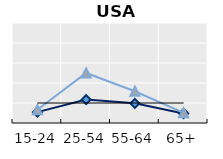
| Category | Public goods | Individual items only | Series 1 |
|---|---|---|---|
| 15-24 | 0.544 | 0.665 | 1 |
| 25-54 | 1.169 | 2.503 | 1 |
| 55-64 | 0.983 | 1.588 | 1 |
| 65+ | 0.475 | 0.507 | 1 |